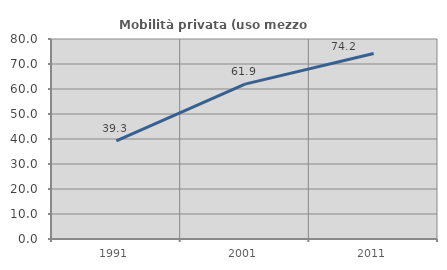
| Category | Mobilità privata (uso mezzo privato) |
|---|---|
| 1991.0 | 39.29 |
| 2001.0 | 61.95 |
| 2011.0 | 74.187 |